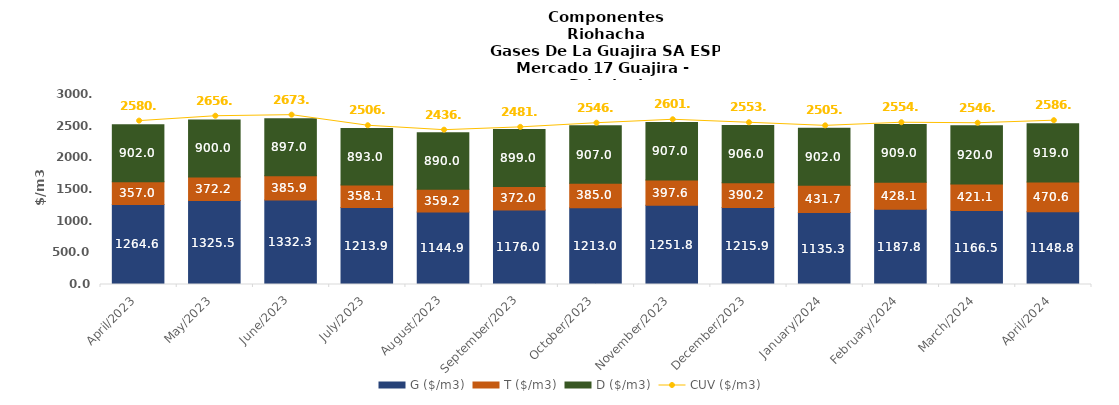
| Category | G ($/m3) | T ($/m3) | D ($/m3) |
|---|---|---|---|
| 2023-04-01 | 1264.63 | 356.99 | 902 |
| 2023-05-01 | 1325.54 | 372.19 | 900 |
| 2023-06-01 | 1332.29 | 385.86 | 897 |
| 2023-07-01 | 1213.88 | 358.06 | 893 |
| 2023-08-01 | 1144.92 | 359.17 | 890 |
| 2023-09-01 | 1176 | 372 | 899 |
| 2023-10-01 | 1213 | 385 | 907 |
| 2023-11-01 | 1251.77 | 397.64 | 907 |
| 2023-12-01 | 1215.86 | 390.2 | 906 |
| 2024-01-01 | 1135.29 | 431.72 | 902 |
| 2024-02-01 | 1187.79 | 428.07 | 909 |
| 2024-03-01 | 1166.47 | 421.06 | 920 |
| 2024-04-01 | 1148.76 | 470.61 | 919 |